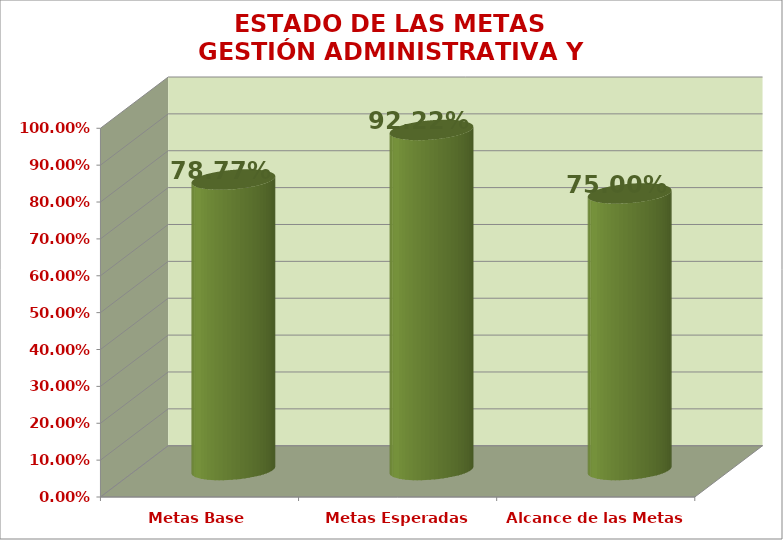
| Category | ESTADO DE LAS METAS GESTIÓN ADMINISTRATIVA Y FINANCIERA |
|---|---|
| Metas Base | 0.788 |
| Metas Esperadas | 0.922 |
| Alcance de las Metas | 0.75 |